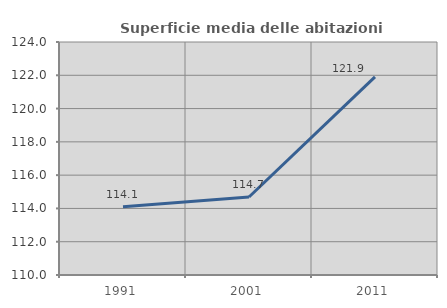
| Category | Superficie media delle abitazioni occupate |
|---|---|
| 1991.0 | 114.1 |
| 2001.0 | 114.688 |
| 2011.0 | 121.906 |